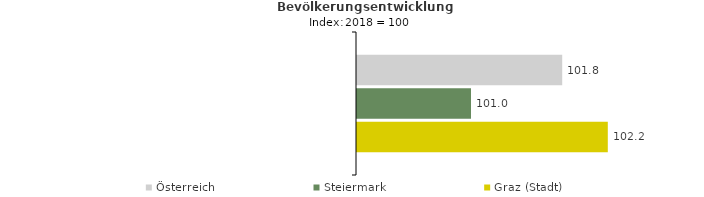
| Category | Österreich | Steiermark | Graz (Stadt) |
|---|---|---|---|
| 2022.0 | 101.8 | 101 | 102.2 |